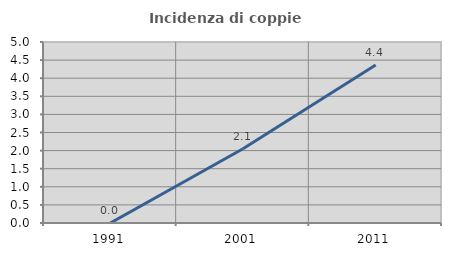
| Category | Incidenza di coppie miste |
|---|---|
| 1991.0 | 0 |
| 2001.0 | 2.051 |
| 2011.0 | 4.367 |